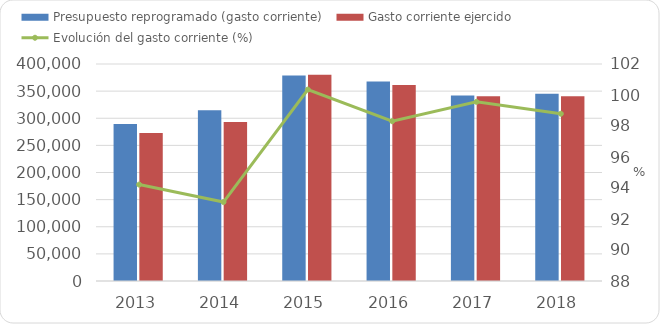
| Category | Presupuesto reprogramado (gasto corriente) | Gasto corriente ejercido |
|---|---|---|
| 2013 | 289428.733 | 272702.822 |
| 2014 | 314864.8 | 293113.7 |
| 2015 | 378700.3 | 380021.6 |
| 2016 | 367600.7 | 361385.3 |
| 2017 | 341839.2 | 340334.7 |
| 2018 | 344938.7 | 340765 |